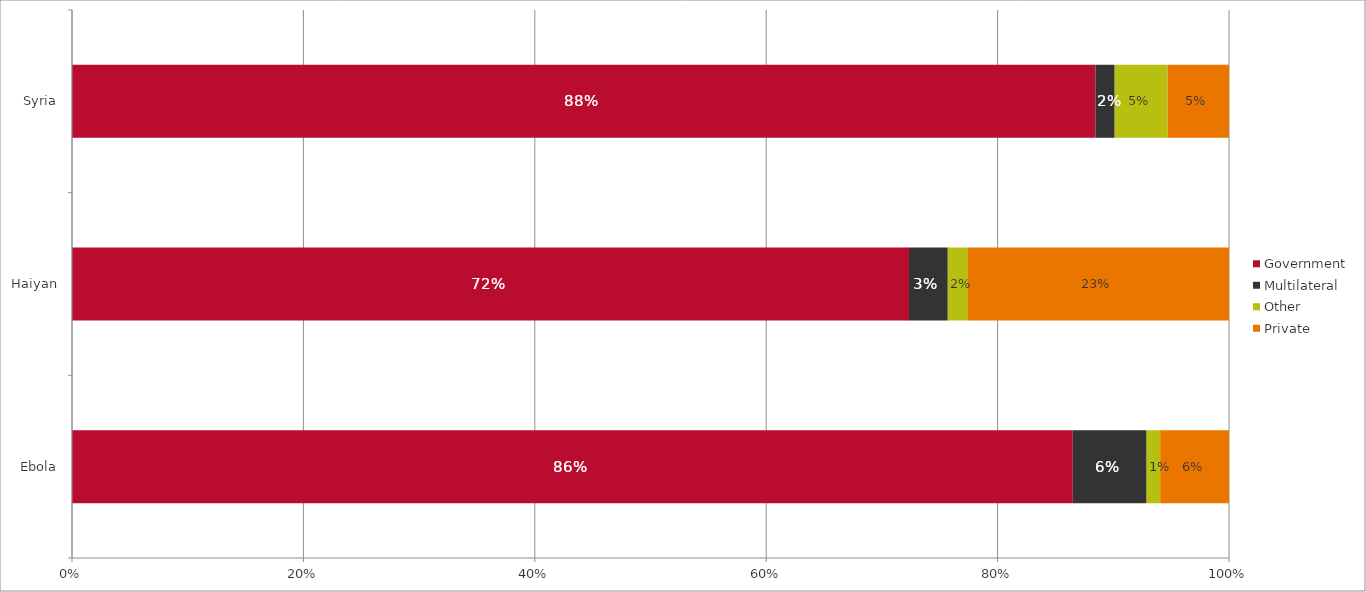
| Category | Government | Multilateral | Other | Private |
|---|---|---|---|---|
| Ebola | 0.865 | 0.064 | 0.012 | 0.059 |
| Haiyan | 0.723 | 0.034 | 0.017 | 0.226 |
| Syria | 0.885 | 0.017 | 0.046 | 0.053 |